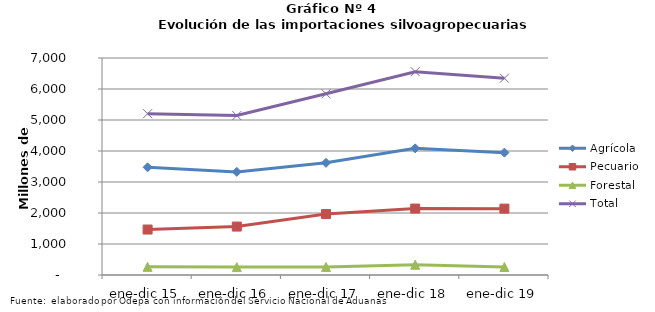
| Category | Agrícola | Pecuario | Forestal | Total |
|---|---|---|---|---|
| ene-dic 15 | 3474061 | 1466730 | 262751 | 5203542 |
| ene-dic 16 | 3325911 | 1562037 | 254803 | 5142751 |
| ene-dic 17 | 3619177 | 1965208 | 260608 | 5844993 |
| ene-dic 18 | 4084928 | 2142662 | 331427 | 6559017 |
| ene-dic 19 | 3947320 | 2140762 | 260092 | 6348174 |